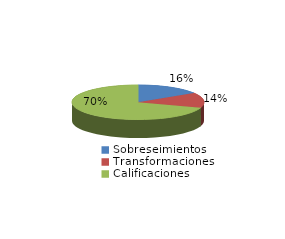
| Category | Series 0 |
|---|---|
| Sobreseimientos | 583 |
| Transformaciones | 509 |
| Calificaciones | 2538 |